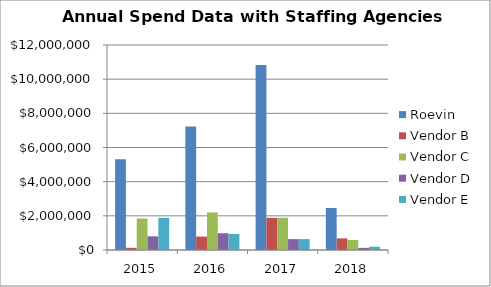
| Category | Roevin  | Vendor B | Vendor C | Vendor D | Vendor E |
|---|---|---|---|---|---|
| 2015.0 | 5306331.57 | 128434.6 | 1843995.41 | 802076.26 | 1880722.08 |
| 2016.0 | 7222911.42 | 785882.46 | 2201544.64 | 981248.65 | 940204.61 |
| 2017.0 | 10822998.08 | 1880093.28 | 1887374.94 | 635047.41 | 637539.8 |
| 2018.0 | 2459181.79 | 680682.64 | 584520.6 | 124899.08 | 190534.51 |